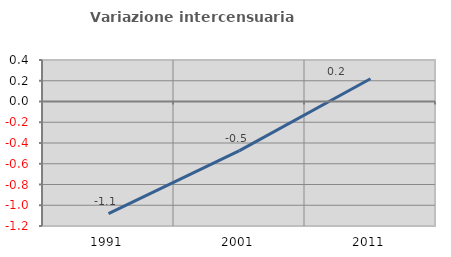
| Category | Variazione intercensuaria annua |
|---|---|
| 1991.0 | -1.081 |
| 2001.0 | -0.474 |
| 2011.0 | 0.219 |